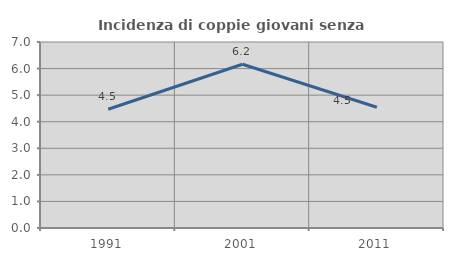
| Category | Incidenza di coppie giovani senza figli |
|---|---|
| 1991.0 | 4.467 |
| 2001.0 | 6.161 |
| 2011.0 | 4.545 |